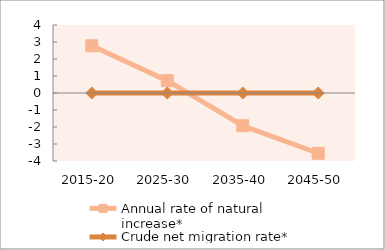
| Category | Annual rate of natural increase* | Crude net migration rate* |
|---|---|---|
| 2015-20 | 2.775 | 0 |
| 2025-30 | 0.725 | 0 |
| 2035-40 | -1.926 | 0 |
| 2045-50 | -3.545 | 0 |